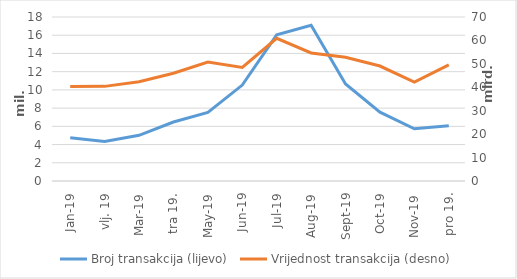
| Category | Broj transakcija (lijevo) |
|---|---|
| sij.19 | 4740654 |
| vlj. 19 | 4345566 |
| ožu.19 | 5018204 |
| tra 19. | 6477561 |
| svi.19 | 7530362 |
| lip.19 | 10527517 |
| srp.19 | 16048224 |
| kol.19 | 17093430 |
| ruj.19 | 10649876 |
| lis.19 | 7549405 |
| stu.19 | 5726743 |
| pro 19. | 6058096 |